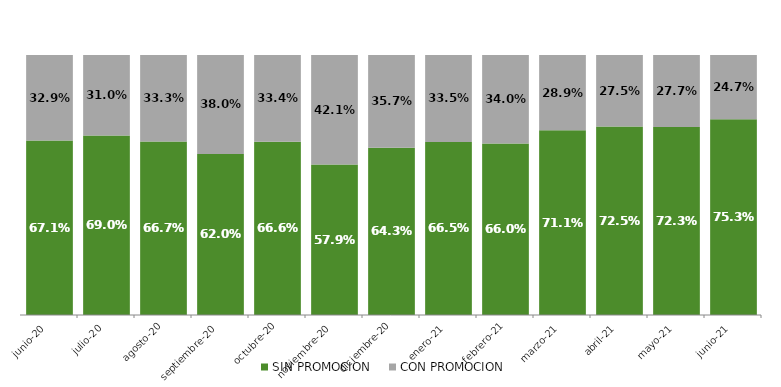
| Category | SIN PROMOCION   | CON PROMOCION   |
|---|---|---|
| 2020-06-01 | 0.671 | 0.329 |
| 2020-07-01 | 0.69 | 0.31 |
| 2020-08-01 | 0.667 | 0.333 |
| 2020-09-01 | 0.62 | 0.38 |
| 2020-10-01 | 0.666 | 0.334 |
| 2020-11-01 | 0.579 | 0.421 |
| 2020-12-01 | 0.643 | 0.357 |
| 2021-01-01 | 0.665 | 0.335 |
| 2021-02-01 | 0.66 | 0.34 |
| 2021-03-01 | 0.711 | 0.289 |
| 2021-04-01 | 0.725 | 0.275 |
| 2021-05-01 | 0.723 | 0.277 |
| 2021-06-01 | 0.753 | 0.247 |